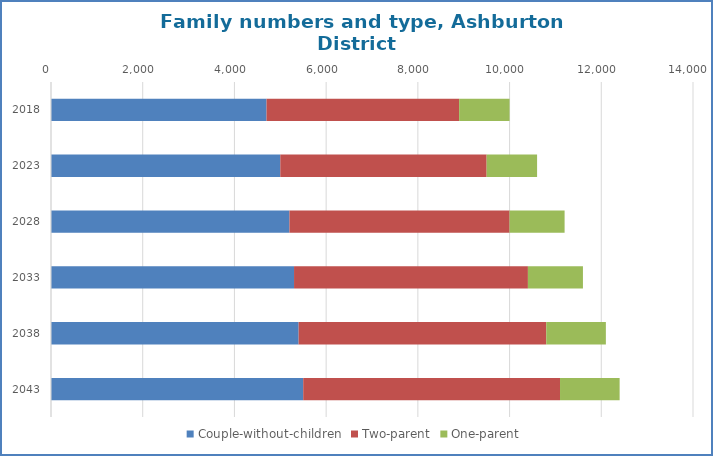
| Category | Couple-without-children | Two-parent | One-parent |
|---|---|---|---|
| 2018.0 | 4700 | 4200 | 1100 |
| 2023.0 | 5000 | 4500 | 1100 |
| 2028.0 | 5200 | 4800 | 1200 |
| 2033.0 | 5300 | 5100 | 1200 |
| 2038.0 | 5400 | 5400 | 1300 |
| 2043.0 | 5500 | 5600 | 1300 |